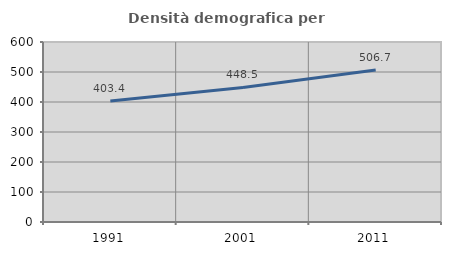
| Category | Densità demografica |
|---|---|
| 1991.0 | 403.39 |
| 2001.0 | 448.466 |
| 2011.0 | 506.742 |